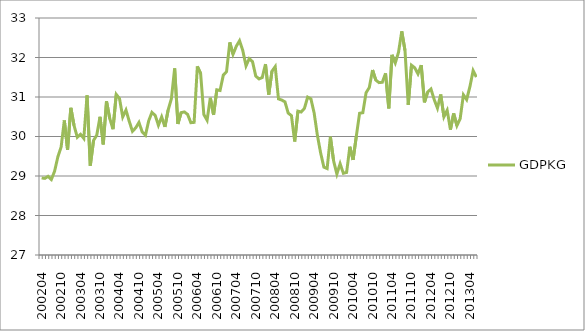
| Category | GDPKG |
|---|---|
| 200204.0 | 28.95 |
| 200205.0 | 28.94 |
| 200206.0 | 28.992 |
| 200207.0 | 28.911 |
| 200208.0 | 29.122 |
| 200209.0 | 29.484 |
| 200210.0 | 29.728 |
| 200211.0 | 30.406 |
| 200212.0 | 29.661 |
| 200301.0 | 30.727 |
| 200302.0 | 30.275 |
| 200303.0 | 29.981 |
| 200304.0 | 30.056 |
| 200305.0 | 29.951 |
| 200306.0 | 31.041 |
| 200307.0 | 29.261 |
| 200308.0 | 29.897 |
| 200309.0 | 30.035 |
| 200310.0 | 30.498 |
| 200311.0 | 29.799 |
| 200312.0 | 30.891 |
| 200401.0 | 30.456 |
| 200402.0 | 30.184 |
| 200403.0 | 31.066 |
| 200404.0 | 30.962 |
| 200405.0 | 30.495 |
| 200406.0 | 30.669 |
| 200407.0 | 30.386 |
| 200408.0 | 30.131 |
| 200409.0 | 30.219 |
| 200410.0 | 30.356 |
| 200411.0 | 30.114 |
| 200412.0 | 30.031 |
| 200501.0 | 30.396 |
| 200502.0 | 30.61 |
| 200503.0 | 30.533 |
| 200504.0 | 30.284 |
| 200505.0 | 30.498 |
| 200506.0 | 30.243 |
| 200507.0 | 30.672 |
| 200508.0 | 30.956 |
| 200509.0 | 31.724 |
| 200510.0 | 30.318 |
| 200511.0 | 30.604 |
| 200512.0 | 30.622 |
| 200601.0 | 30.559 |
| 200602.0 | 30.349 |
| 200603.0 | 30.358 |
| 200604.0 | 31.775 |
| 200605.0 | 31.595 |
| 200606.0 | 30.554 |
| 200607.0 | 30.41 |
| 200608.0 | 30.979 |
| 200609.0 | 30.548 |
| 200610.0 | 31.182 |
| 200611.0 | 31.164 |
| 200612.0 | 31.555 |
| 200701.0 | 31.641 |
| 200702.0 | 32.383 |
| 200703.0 | 32.081 |
| 200704.0 | 32.284 |
| 200705.0 | 32.424 |
| 200706.0 | 32.176 |
| 200707.0 | 31.787 |
| 200708.0 | 31.972 |
| 200709.0 | 31.895 |
| 200710.0 | 31.531 |
| 200711.0 | 31.458 |
| 200712.0 | 31.493 |
| 200801.0 | 31.833 |
| 200802.0 | 31.059 |
| 200803.0 | 31.654 |
| 200804.0 | 31.769 |
| 200805.0 | 30.953 |
| 200806.0 | 30.923 |
| 200807.0 | 30.878 |
| 200808.0 | 30.592 |
| 200809.0 | 30.529 |
| 200810.0 | 29.873 |
| 200811.0 | 30.641 |
| 200812.0 | 30.621 |
| 200901.0 | 30.712 |
| 200902.0 | 30.998 |
| 200903.0 | 30.954 |
| 200904.0 | 30.593 |
| 200905.0 | 30.028 |
| 200906.0 | 29.582 |
| 200907.0 | 29.224 |
| 200908.0 | 29.189 |
| 200909.0 | 29.993 |
| 200910.0 | 29.381 |
| 200911.0 | 29.05 |
| 200912.0 | 29.312 |
| 201001.0 | 29.069 |
| 201002.0 | 29.091 |
| 201003.0 | 29.741 |
| 201004.0 | 29.408 |
| 201005.0 | 30.01 |
| 201006.0 | 30.587 |
| 201007.0 | 30.602 |
| 201008.0 | 31.106 |
| 201009.0 | 31.239 |
| 201010.0 | 31.683 |
| 201011.0 | 31.428 |
| 201012.0 | 31.364 |
| 201101.0 | 31.372 |
| 201102.0 | 31.599 |
| 201103.0 | 30.712 |
| 201104.0 | 32.068 |
| 201105.0 | 31.863 |
| 201106.0 | 32.131 |
| 201107.0 | 32.662 |
| 201108.0 | 32.177 |
| 201109.0 | 30.802 |
| 201110.0 | 31.805 |
| 201111.0 | 31.739 |
| 201112.0 | 31.585 |
| 201201.0 | 31.806 |
| 201202.0 | 30.866 |
| 201203.0 | 31.127 |
| 201204.0 | 31.202 |
| 201205.0 | 30.934 |
| 201206.0 | 30.719 |
| 201207.0 | 31.063 |
| 201208.0 | 30.5 |
| 201209.0 | 30.662 |
| 201210.0 | 30.175 |
| 201211.0 | 30.584 |
| 201212.0 | 30.275 |
| 201301.0 | 30.451 |
| 201302.0 | 31.055 |
| 201303.0 | 30.933 |
| 201304.0 | 31.259 |
| 201305.0 | 31.668 |
| 201306.0 | 31.505 |